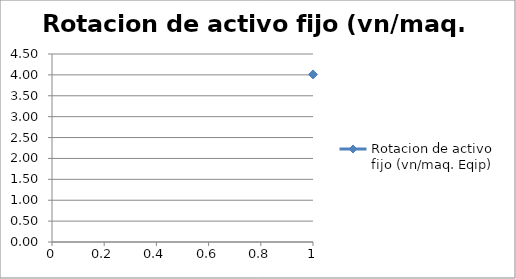
| Category | Rotacion de activo fijo (vn/maq. Eqip) |
|---|---|
| 0 | 4.011 |
| 1 | 4.011 |
| 2 | 4.011 |
| 3 | 4.011 |
| 4 | 4.011 |
| 5 | 4.011 |
| 6 | 4.011 |
| 7 | 4.011 |